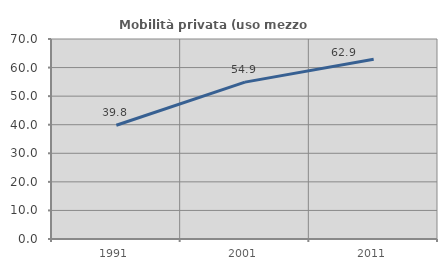
| Category | Mobilità privata (uso mezzo privato) |
|---|---|
| 1991.0 | 39.806 |
| 2001.0 | 54.899 |
| 2011.0 | 62.926 |